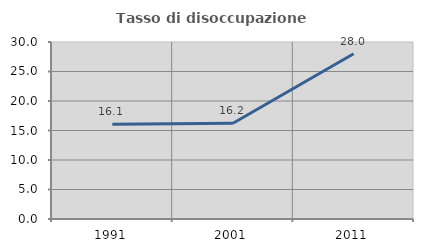
| Category | Tasso di disoccupazione giovanile  |
|---|---|
| 1991.0 | 16.071 |
| 2001.0 | 16.216 |
| 2011.0 | 28 |